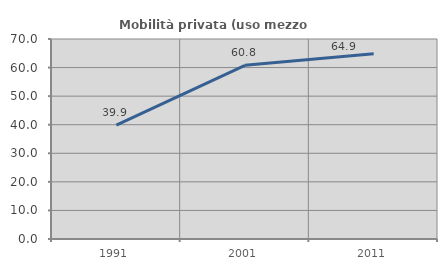
| Category | Mobilità privata (uso mezzo privato) |
|---|---|
| 1991.0 | 39.877 |
| 2001.0 | 60.79 |
| 2011.0 | 64.869 |